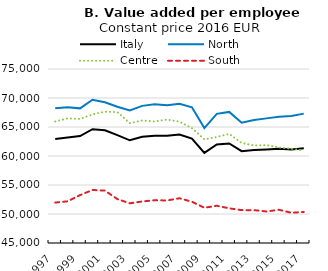
| Category | Italy | North | Centre | South |
|---|---|---|---|---|
| 1997.0 | 62939.497 | 68216.832 | 65952.621 | 51972.206 |
| 1998.0 | 63186.074 | 68411.034 | 66476.173 | 52188.227 |
| 1999.0 | 63437.453 | 68215.63 | 66388.813 | 53261.138 |
| 2000.0 | 64615.346 | 69691.217 | 67184.88 | 54144.722 |
| 2001.0 | 64448.779 | 69253.248 | 67636.821 | 54029.036 |
| 2002.0 | 63591.987 | 68498.16 | 67568.569 | 52572.494 |
| 2003.0 | 62704.339 | 67852.927 | 65660.984 | 51845.83 |
| 2004.0 | 63322.727 | 68645.119 | 66117.622 | 52159.393 |
| 2005.0 | 63499.5 | 68925.506 | 65952.522 | 52370.486 |
| 2006.0 | 63484.374 | 68757.613 | 66283.279 | 52336.087 |
| 2007.0 | 63689.587 | 69003.327 | 65917.521 | 52712.75 |
| 2008.0 | 63017.469 | 68397.376 | 64807.343 | 52117.644 |
| 2009.0 | 60544.948 | 64805.445 | 62866.414 | 51073.912 |
| 2010.0 | 61995.459 | 67267.847 | 63284.993 | 51425.599 |
| 2011.0 | 62165.188 | 67600.734 | 63808.377 | 50976.099 |
| 2012.0 | 60833.656 | 65731.545 | 62244.413 | 50668.399 |
| 2013.0 | 61015.421 | 66203.578 | 61817.399 | 50665.157 |
| 2014.0 | 61114.044 | 66486.718 | 61876.763 | 50432.291 |
| 2015.0 | 61246.346 | 66778.28 | 61466.271 | 50728.208 |
| 2016.0 | 61127.897 | 66895.502 | 61253.588 | 50210.867 |
| 2017.0 | 61332.901 | 67304.615 | 60950.783 | 50350.635 |